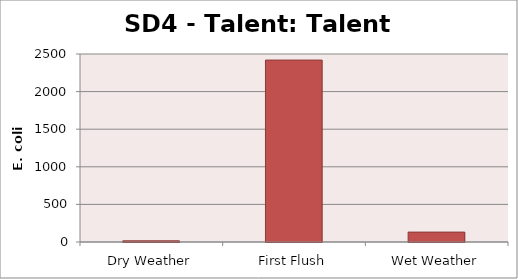
| Category | E. coli MPN |
|---|---|
| Dry Weather | 15.6 |
| First Flush | 2419.2 |
| Wet Weather | 131.7 |